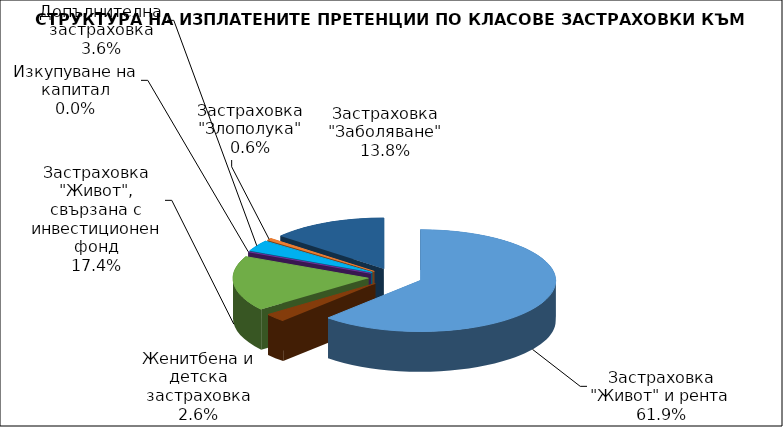
| Category | Застраховка "Живот" и рента |
|---|---|
| Застраховка "Живот" и рента | 47175650.64 |
| Женитбена и детска застраховка | 2003891.561 |
| Застраховка "Живот", свързана с инвестиционен фонд | 13293065.298 |
| Изкупуване на капитал | 0 |
| Допълнителна застраховка | 2709087.533 |
| Застраховка "Злополука" | 488037.413 |
| Застраховка "Заболяване" | 10530910.443 |